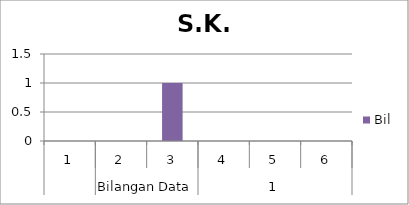
| Category | Bil |
|---|---|
| 0 | 0 |
| 1 | 0 |
| 2 | 1 |
| 3 | 0 |
| 4 | 0 |
| 5 | 0 |